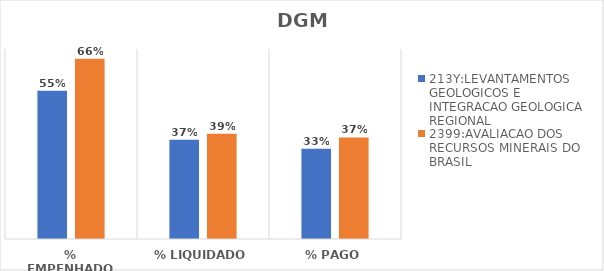
| Category | 213Y:LEVANTAMENTOS GEOLOGICOS E INTEGRACAO GEOLOGICA REGIONAL | 2399:AVALIACAO DOS RECURSOS MINERAIS DO BRASIL |
|---|---|---|
| % EMPENHADO | 0.547 | 0.664 |
| % LIQUIDADO | 0.365 | 0.388 |
| % PAGO | 0.333 | 0.374 |